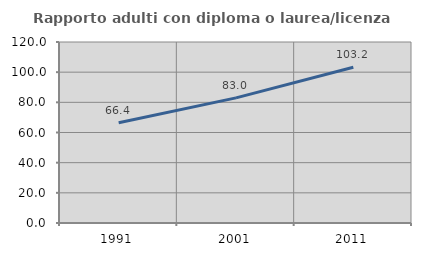
| Category | Rapporto adulti con diploma o laurea/licenza media  |
|---|---|
| 1991.0 | 66.443 |
| 2001.0 | 82.967 |
| 2011.0 | 103.243 |